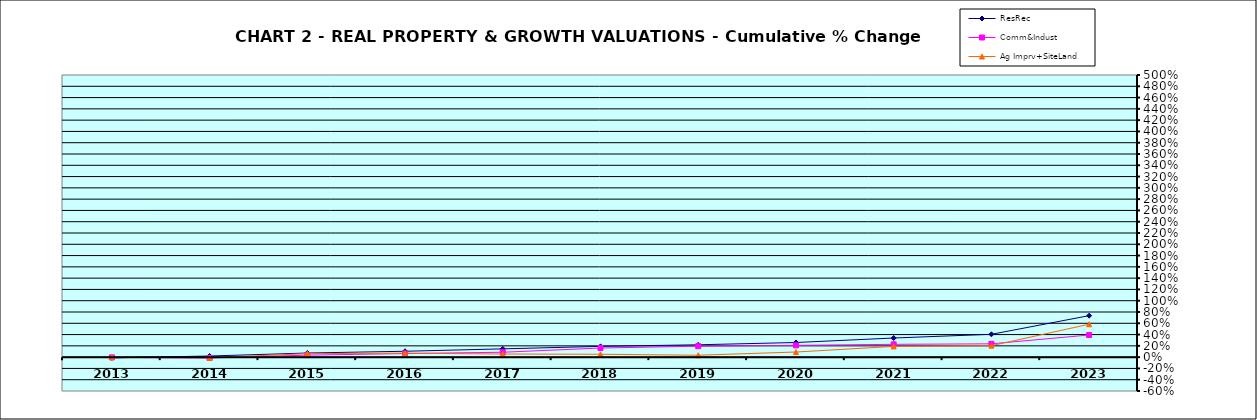
| Category | ResRec | Comm&Indust | Ag Imprv+SiteLand |
|---|---|---|---|
| 2013.0 | -0.013 | -0.004 | 0 |
| 2014.0 | 0.02 | -0.014 | -0.012 |
| 2015.0 | 0.073 | 0.035 | 0.062 |
| 2016.0 | 0.104 | 0.063 | 0.072 |
| 2017.0 | 0.147 | 0.087 | 0.055 |
| 2018.0 | 0.191 | 0.162 | 0.051 |
| 2019.0 | 0.219 | 0.194 | 0.034 |
| 2020.0 | 0.259 | 0.209 | 0.091 |
| 2021.0 | 0.339 | 0.227 | 0.19 |
| 2022.0 | 0.405 | 0.236 | 0.204 |
| 2023.0 | 0.735 | 0.392 | 0.583 |